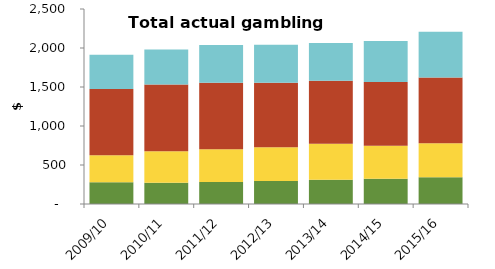
| Category | NZ Racing Board (TAB) | NZ Lotteries Commission | Gaming machines (outside casinos) | Casinos |
|---|---|---|---|---|
| 2009/10 | 278.393 | 346.622 | 849.163 | 439.795 |
| 2010/11 | 272.793 | 404.477 | 856.099 | 448.337 |
| 2011/12 | 282.951 | 418.739 | 853.954 | 482.662 |
| 2012/13 | 294.285 | 431.824 | 826.779 | 489.573 |
| 2013/14 | 310.171 | 463.06 | 806.271 | 485.655 |
| 2014/15 | 325.051 | 420.377 | 818.113 | 527.104 |
| 2015/16 | 342.291 | 437.262 | 843.482 | 585.622 |